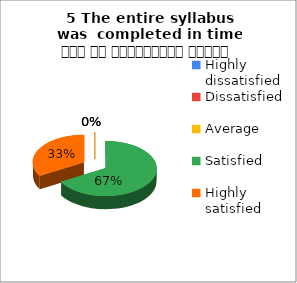
| Category | 5 The entire syllabus was  completed in time समय पर पाठ्यक्रम पूर्ण हुआ |
|---|---|
| Highly dissatisfied | 0 |
| Dissatisfied | 0 |
| Average | 0 |
| Satisfied | 6 |
| Highly satisfied | 3 |